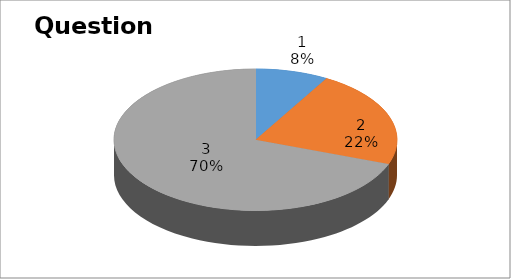
| Category | Series 0 |
|---|---|
| 0 | 3 |
| 1 | 8 |
| 2 | 25 |